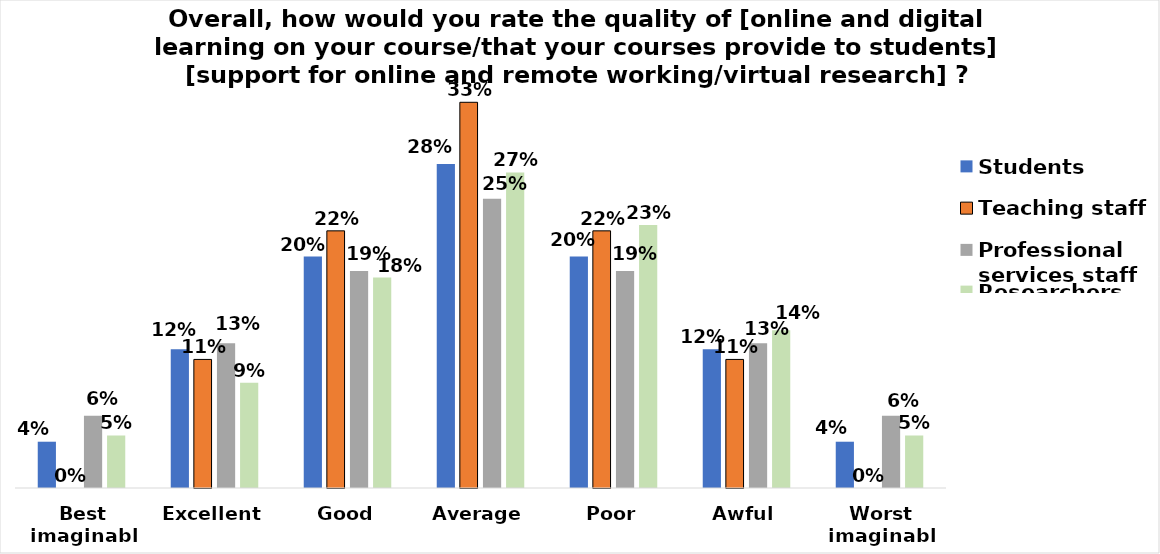
| Category | Students | Teaching staff | Professional services staff | Researchers |
|---|---|---|---|---|
| Best imaginable | 0.04 | 0 | 0.062 | 0.045 |
| Excellent | 0.12 | 0.111 | 0.125 | 0.091 |
| Good | 0.2 | 0.222 | 0.188 | 0.182 |
| Average | 0.28 | 0.333 | 0.25 | 0.273 |
| Poor | 0.2 | 0.222 | 0.188 | 0.227 |
| Awful | 0.12 | 0.111 | 0.125 | 0.136 |
| Worst imaginable | 0.04 | 0 | 0.062 | 0.045 |